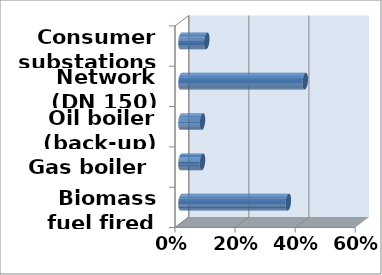
| Category | Series 0 |
|---|---|
| Biomass fuel fired boiler | 0.357 |
| Gas boiler | 0.071 |
| Oil boiler (back-up) | 0.071 |
| Network (DN 150) | 0.414 |
| Consumer substations | 0.086 |